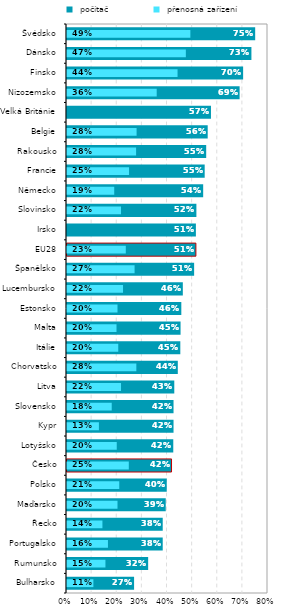
| Category |  počítač |
|---|---|
| Bulharsko | 0.267 |
| Rumunsko | 0.323 |
| Portugalsko | 0.381 |
| Řecko | 0.381 |
| Maďarsko | 0.393 |
| Polsko | 0.397 |
| Česko | 0.416 |
| Lotyšsko | 0.423 |
| Kypr | 0.424 |
| Slovensko | 0.424 |
| Litva | 0.427 |
| Chorvatsko | 0.441 |
| Itálie | 0.451 |
| Malta | 0.452 |
| Estonsko | 0.455 |
| Lucembursko | 0.461 |
| Španělsko | 0.506 |
| EU28 | 0.513 |
| Irsko | 0.513 |
| Slovinsko | 0.515 |
| Německo | 0.542 |
| Francie | 0.548 |
| Rakousko | 0.554 |
| Belgie | 0.56 |
| Velká Británie | 0.573 |
| Nizozemsko | 0.687 |
| Finsko | 0.701 |
| Dánsko | 0.734 |
| Švédsko | 0.749 |